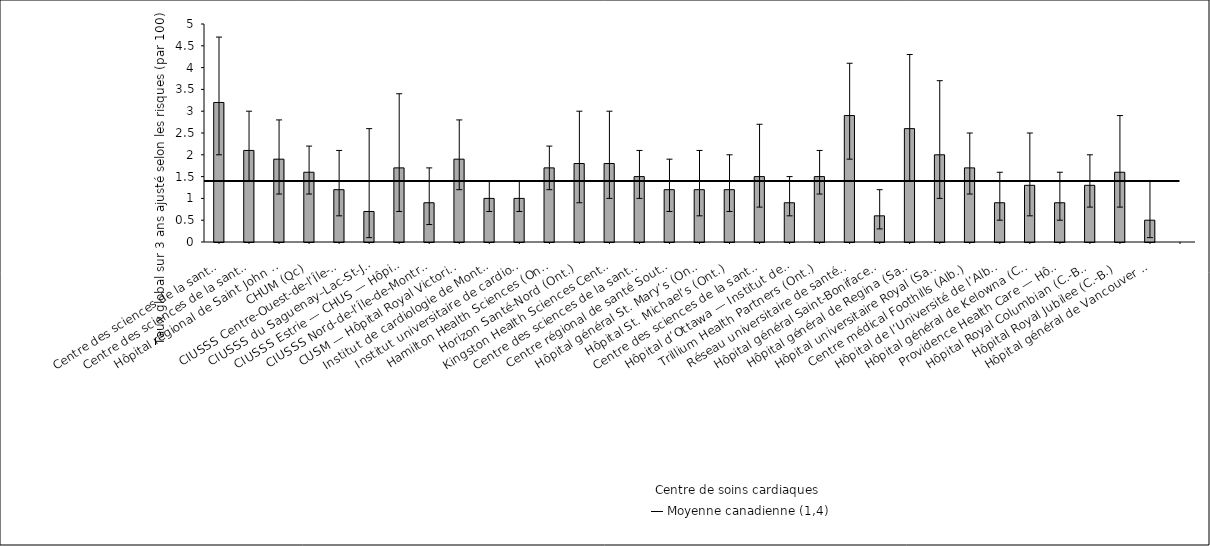
| Category | Taux ajusté selon 
les risques |
|---|---|
| Centre des sciences de la santé — St. John’s* (T. -N.-L.) | 3.2 |
| Centre des sciences de la santé Queen Elizabeth II (N.-É.) | 2.1 |
| Hôpital régional de Saint John (N.-B.) | 1.9 |
| CHUM (Qc) | 1.6 |
| CIUSSS Centre-Ouest-de-l’Île-de-Mtl — Hôpital général juif (Qc) | 1.2 |
| CIUSSS du Saguenay–Lac-St-Jean — Hôpital de Chicoutimi (Qc) | 0.7 |
| CIUSSS Estrie — CHUS — Hôpital Fleurimont (Qc) | 1.7 |
| CIUSSS Nord-de-l’Île-de-Montréal — Hôpital du Sacré-Cœur de Montréal (Qc) | 0.9 |
| CUSM — Hôpital Royal Victoria (Qc) | 1.9 |
| Institut de cardiologie de Montréal (Qc) | 1 |
| Institut universitaire de cardiologie et pneumologie de Québec (Qc) | 1 |
| Hamilton Health Sciences (Ont.) | 1.7 |
| Horizon Santé-Nord (Ont.) | 1.8 |
| Kingston Health Sciences Centre (Ont.) | 1.8 |
| Centre des sciences de la santé de London (Ont.) | 1.5 |
| Centre régional de santé Southlake (Ont.) | 1.2 |
| Hôpital général St. Mary’s (Ont.) | 1.2 |
| Hôpital St. Michael’s (Ont.) | 1.2 |
| Centre des sciences de la santé Sunnybrook (Ont.) | 1.5 |
| Hôpital d’Ottawa — Institut de cardiologie de l’Université d’Ottawa (Ont.) | 0.9 |
| Trillium Health Partners (Ont.) | 1.5 |
| Réseau universitaire de santé* (Ont.) | 2.9 |
| Hôpital général Saint-Boniface* (Man.) | 0.6 |
| Hôpital général de Regina (Sask.) | 2.6 |
| Hôpital universitaire Royal (Sask.) | 2 |
| Centre médical Foothills (Alb.) | 1.7 |
| Hôpital de l’Université de l’Alberta (Alb.) | 0.9 |
| Hôpital général de Kelowna (C.-B.) | 1.3 |
| Providence Health Care — Hôpital St. Paul’s (Vancouver) (C.-B.) | 0.9 |
| Hôpital Royal Columbian (C.-B.) | 1.3 |
| Hôpital Royal Jubilee (C.-B.) | 1.6 |
| Hôpital général de Vancouver (C.-B.) | 0.5 |